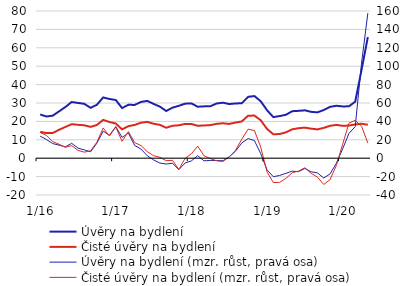
| Category | Úvěry na bydlení | Čisté úvěry na bydlení |
|---|---|---|
|  1/16 | 23.745 | 14.299 |
| 2 | 22.673 | 13.677 |
| 3 | 23.115 | 13.704 |
| 4 | 25.469 | 15.456 |
| 5 | 27.807 | 16.98 |
| 6 | 30.54 | 18.499 |
| 7 | 30.042 | 18.154 |
| 8 | 29.555 | 17.875 |
| 9 | 27.388 | 17.023 |
| 10 | 29.036 | 18.044 |
| 11 | 33.011 | 20.829 |
| 12 | 32.18 | 19.666 |
|  1/17 | 31.63 | 18.86 |
| 2 | 27.255 | 15.667 |
| 3 | 29.015 | 17.424 |
| 4 | 28.955 | 18.083 |
| 5 | 30.579 | 19.281 |
| 6 | 31.145 | 19.759 |
| 7 | 29.509 | 18.729 |
| 8 | 28.03 | 18.109 |
| 9 | 25.655 | 16.561 |
| 10 | 27.462 | 17.612 |
| 11 | 28.474 | 17.888 |
| 12 | 29.638 | 18.625 |
|  1/18 | 29.767 | 18.587 |
| 2 | 27.982 | 17.634 |
| 3 | 28.173 | 17.779 |
| 4 | 28.224 | 17.993 |
| 5 | 29.726 | 18.68 |
| 6 | 30.168 | 18.974 |
| 7 | 29.437 | 18.624 |
| 8 | 29.74 | 19.378 |
| 9 | 29.882 | 19.973 |
| 10 | 33.339 | 23.116 |
| 11 | 33.777 | 23.15 |
| 12 | 30.953 | 20.646 |
|  1/19 | 26.1 | 15.915 |
| 2 | 22.327 | 12.995 |
| 3 | 22.899 | 13.133 |
| 4 | 23.601 | 14.069 |
| 5 | 25.548 | 15.695 |
| 6 | 25.733 | 16.297 |
| 7 | 26.022 | 16.623 |
| 8 | 25.198 | 16.052 |
| 9 | 24.905 | 15.653 |
| 10 | 26.179 | 16.483 |
| 11 | 27.909 | 17.605 |
| 12 | 28.486 | 18.093 |
|  1/20 | 28.135 | 17.61 |
| 2 | 28.193 | 17.742 |
| 3 | 30.749 | 18.38 |
| 4 | 48.01 | 18.716 |
| 5 | 65.843 | 18.19 |